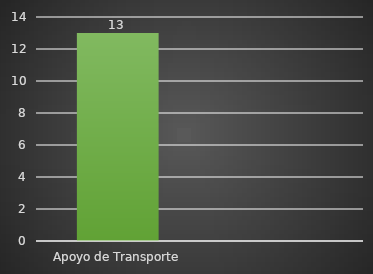
| Category | INDICADOR  |
|---|---|
| Apoyo de Transporte | 13 |